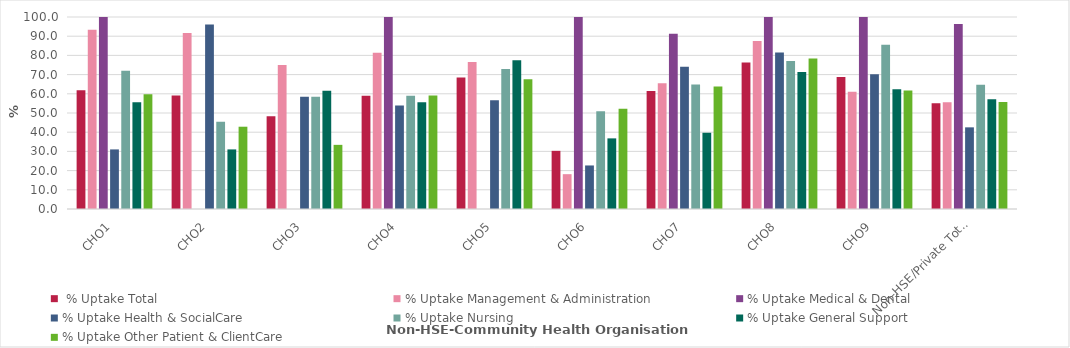
| Category |  % Uptake Total | % Uptake Management & Administration | % Uptake Medical & Dental | % Uptake Health & SocialCare | % Uptake Nursing | % Uptake General Support | % Uptake Other Patient & ClientCare |
|---|---|---|---|---|---|---|---|
| CHO1 | 61.856 | 93.333 | 100 | 31.034 | 72 | 55.556 | 59.701 |
| CHO2 | 59.091 | 91.667 | 0 | 96.154 | 45.455 | 31.034 | 42.857 |
| CHO3 | 48.353 | 75 | 0 | 58.519 | 58.462 | 61.538 | 33.41 |
| CHO4 | 58.955 | 81.429 | 100 | 53.846 | 58.939 | 55.556 | 59.172 |
| CHO5 | 68.505 | 76.596 | 0 | 56.684 | 72.951 | 77.5 | 67.63 |
| CHO6 | 30.289 | 18.14 | 100 | 22.677 | 50.867 | 36.782 | 52.195 |
| CHO7 | 61.397 | 65.455 | 91.304 | 74.074 | 64.832 | 39.713 | 63.859 |
| CHO8 | 76.364 | 87.5 | 100 | 81.481 | 77.143 | 71.333 | 78.378 |
| CHO9 | 68.798 | 61.111 | 100 | 70.213 | 85.484 | 62.329 | 61.733 |
| Non-HSE/Private Total | 55.065 | 55.624 | 96.364 | 42.527 | 64.737 | 57.179 | 55.737 |